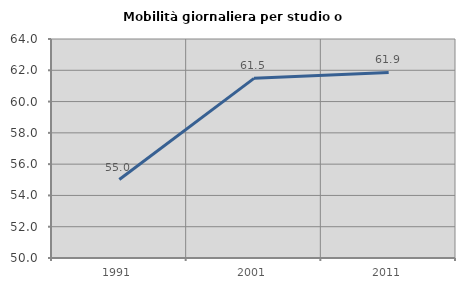
| Category | Mobilità giornaliera per studio o lavoro |
|---|---|
| 1991.0 | 55.018 |
| 2001.0 | 61.485 |
| 2011.0 | 61.861 |